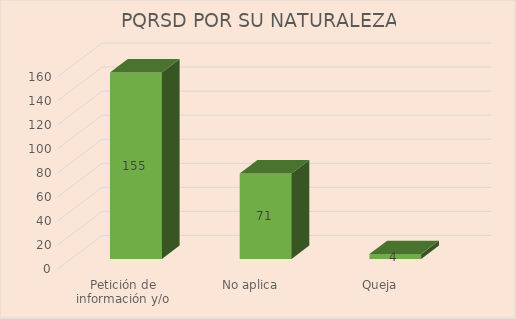
| Category | Series 0 |
|---|---|
| Petición de información y/o documentación | 155 |
| No aplica | 71 |
| Queja | 4 |